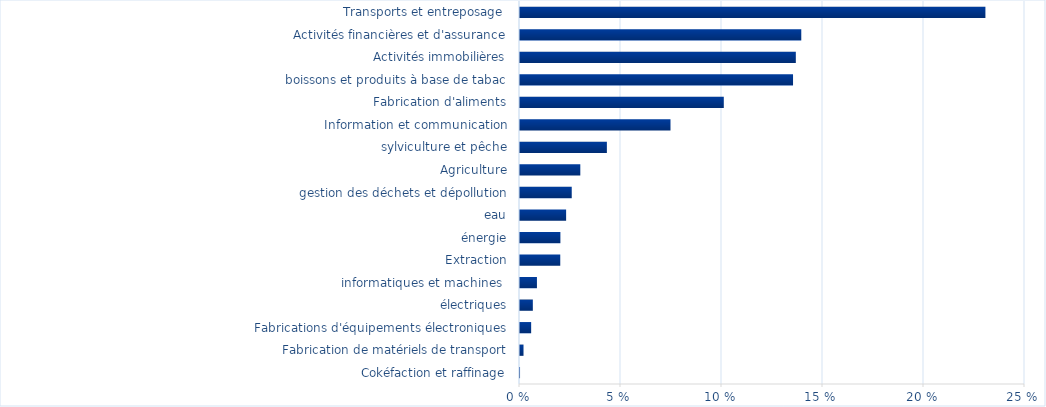
| Category | Total |
|---|---|
| Cokéfaction et raffinage | 0 |
| Fabrication de matériels de transport | 0.002 |
| Fabrications d'équipements électroniques, électriques, informatiques et machines  | 0.006 |
| Extraction, énergie, eau, gestion des déchets et dépollution | 0.006 |
| Agriculture, sylviculture et pêche | 0.008 |
| Information et communication | 0.02 |
| Fabrication d'aliments, boissons et produits à base de tabac | 0.02 |
| Activités immobilières | 0.023 |
| Activités financières et d'assurance | 0.026 |
| Transports et entreposage  | 0.03 |
| Fabrication autres produits industriels  | 0.043 |
| Administration publique, enseignement, santé et action sociale | 0.074 |
| Autres activités de services | 0.101 |
| Hébergement et restauration | 0.135 |
| Construction | 0.137 |
| Activités spécialisées, scientifiques et techniques, services admnistratifs et de soutien | 0.139 |
| Commerce | 0.23 |